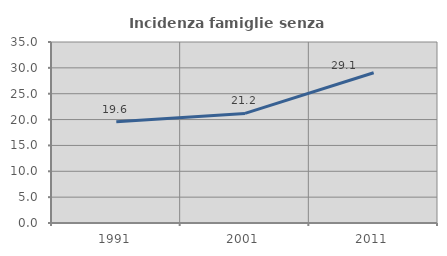
| Category | Incidenza famiglie senza nuclei |
|---|---|
| 1991.0 | 19.593 |
| 2001.0 | 21.185 |
| 2011.0 | 29.063 |